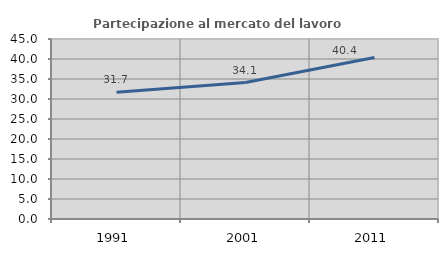
| Category | Partecipazione al mercato del lavoro  femminile |
|---|---|
| 1991.0 | 31.707 |
| 2001.0 | 34.11 |
| 2011.0 | 40.369 |